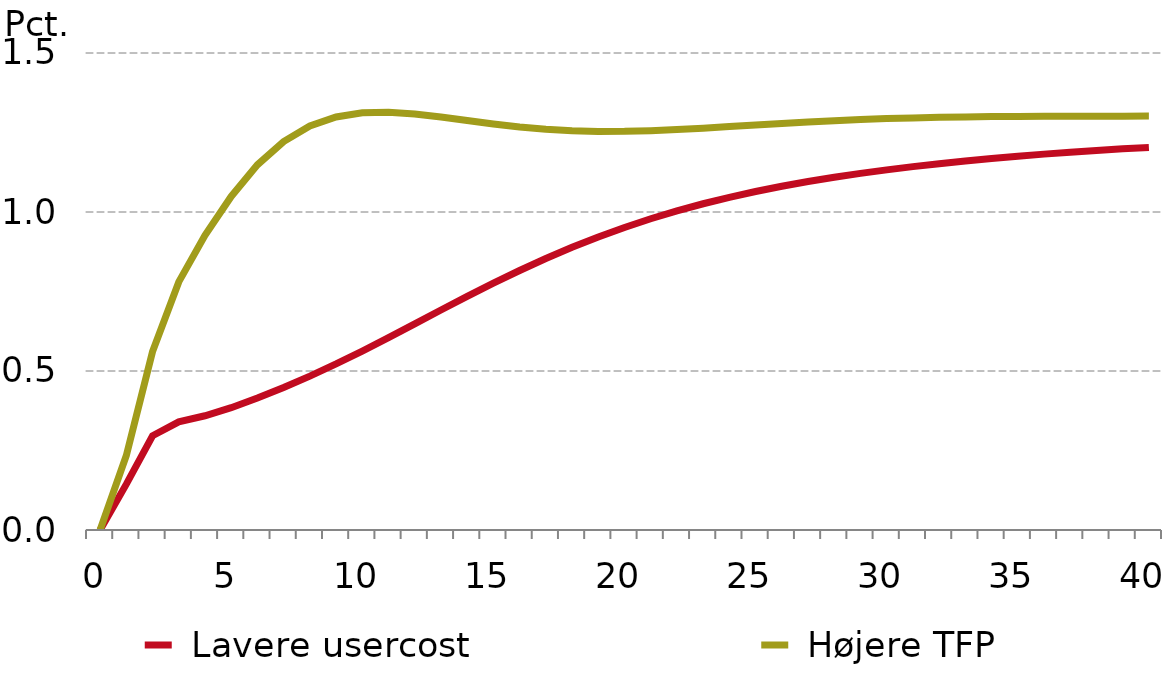
| Category |  Lavere usercost |  Højere TFP |
|---|---|---|
| 0.0 | 0 | 0 |
| nan | 0.144 | 0.234 |
| nan | 0.296 | 0.561 |
| nan | 0.34 | 0.78 |
| nan | 0.359 | 0.927 |
| 5.0 | 0.385 | 1.049 |
| nan | 0.415 | 1.148 |
| nan | 0.448 | 1.222 |
| nan | 0.484 | 1.27 |
| nan | 0.522 | 1.299 |
| 10.0 | 0.563 | 1.312 |
| nan | 0.605 | 1.314 |
| nan | 0.648 | 1.308 |
| nan | 0.692 | 1.299 |
| nan | 0.735 | 1.287 |
| 15.0 | 0.776 | 1.277 |
| nan | 0.816 | 1.267 |
| nan | 0.854 | 1.26 |
| nan | 0.889 | 1.255 |
| nan | 0.922 | 1.253 |
| 20.0 | 0.951 | 1.254 |
| nan | 0.979 | 1.256 |
| nan | 1.004 | 1.259 |
| nan | 1.026 | 1.264 |
| nan | 1.046 | 1.269 |
| 25.0 | 1.064 | 1.274 |
| nan | 1.081 | 1.279 |
| nan | 1.096 | 1.283 |
| nan | 1.109 | 1.287 |
| nan | 1.121 | 1.291 |
| 30.0 | 1.133 | 1.294 |
| nan | 1.143 | 1.296 |
| nan | 1.152 | 1.298 |
| nan | 1.16 | 1.299 |
| nan | 1.168 | 1.3 |
| 35.0 | 1.175 | 1.301 |
| nan | 1.182 | 1.301 |
| nan | 1.188 | 1.301 |
| nan | 1.194 | 1.301 |
| nan | 1.199 | 1.301 |
| 40.0 | 1.203 | 1.302 |